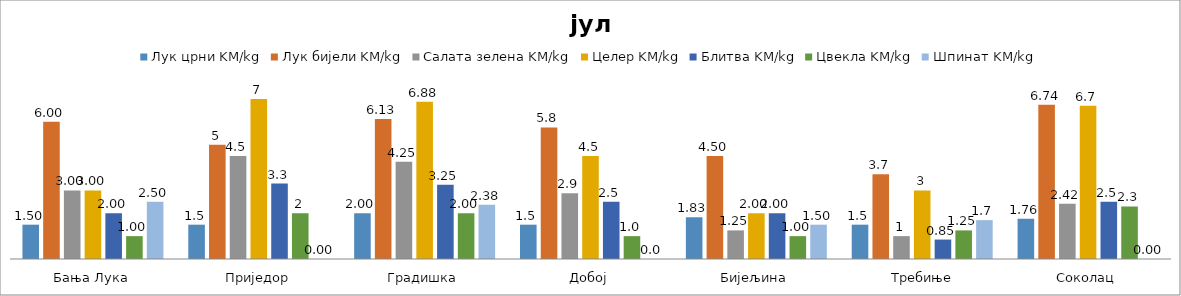
| Category | Лук црни KM/kg | Лук бијели KM/kg | Салата зелена KM/kg | Целер KM/kg | Блитва KM/kg | Цвекла KM/kg | Шпинат KM/kg |
|---|---|---|---|---|---|---|---|
| Бања Лука | 1.5 | 6 | 3 | 3 | 2 | 1 | 2.5 |
| Приједор | 1.5 | 5 | 4.5 | 7 | 3.3 | 2 | 0 |
| Градишка | 2 | 6.125 | 4.25 | 6.875 | 3.25 | 2 | 2.375 |
| Добој | 1.5 | 5.75 | 2.875 | 4.5 | 2.5 | 1 | 0 |
| Бијељина | 1.825 | 4.5 | 1.25 | 2 | 2 | 1 | 1.5 |
|  Требиње | 1.5 | 3.7 | 1 | 3 | 0.85 | 1.25 | 1.7 |
| Соколац | 1.76 | 6.74 | 2.42 | 6.7 | 2.5 | 2.3 | 0 |